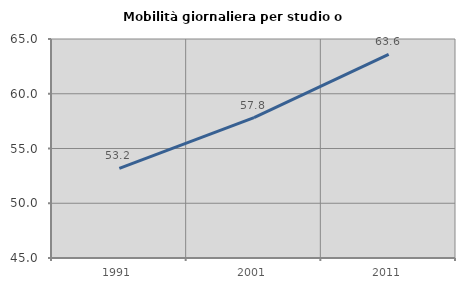
| Category | Mobilità giornaliera per studio o lavoro |
|---|---|
| 1991.0 | 53.188 |
| 2001.0 | 57.818 |
| 2011.0 | 63.586 |